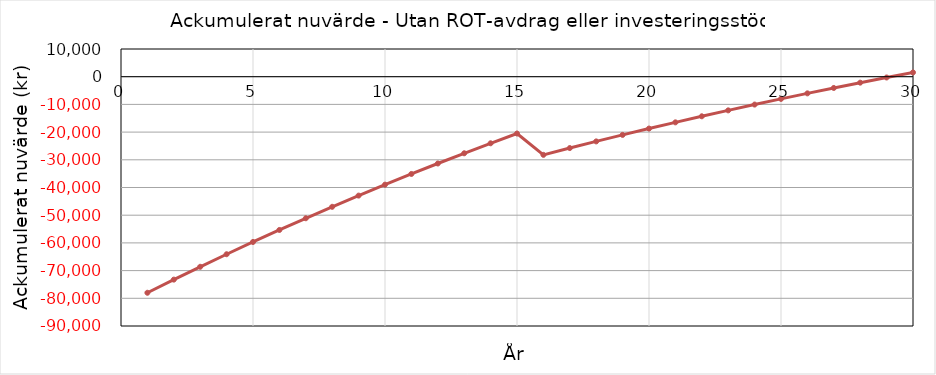
| Category | Ackumulerat |
|---|---|
| 0 | -78000 |
| 1 | -73257.688 |
| 2 | -68622.311 |
| 3 | -64091.457 |
| 4 | -59662.769 |
| 5 | -55333.944 |
| 6 | -51102.73 |
| 7 | -46966.925 |
| 8 | -42924.378 |
| 9 | -38972.988 |
| 10 | -35110.697 |
| 11 | -31335.497 |
| 12 | -27645.424 |
| 13 | -24038.558 |
| 14 | -20513.024 |
| 15 | -28212.208 |
| 16 | -25757.959 |
| 17 | -23359.05 |
| 18 | -21014.235 |
| 19 | -18722.293 |
| 20 | -16482.032 |
| 21 | -14292.286 |
| 22 | -12151.918 |
| 23 | -10059.812 |
| 24 | -8014.881 |
| 25 | -6016.062 |
| 26 | -4062.314 |
| 27 | -2152.621 |
| 28 | -285.99 |
| 29 | 1538.551 |
| 30 | 3321.95 |
| 31 | 0 |
| 32 | 0 |
| 33 | 0 |
| 34 | 0 |
| 35 | 0 |
| 36 | 0 |
| 37 | 0 |
| 38 | 0 |
| 39 | 0 |
| 40 | 0 |
| 41 | 0 |
| 42 | 0 |
| 43 | 0 |
| 44 | 0 |
| 45 | 0 |
| 46 | 0 |
| 47 | 0 |
| 48 | 0 |
| 49 | 0 |
| 50 | 0 |